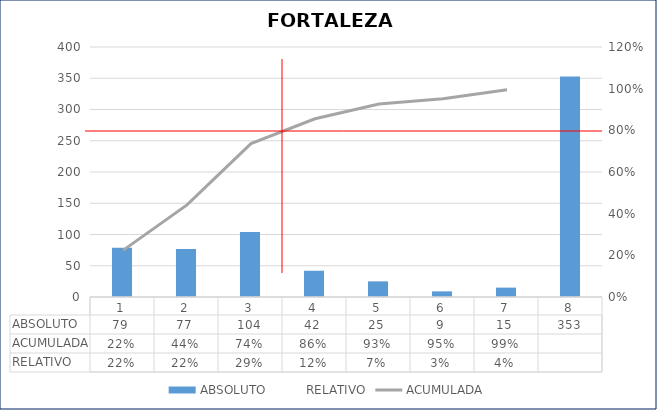
| Category | ABSOLUTO |
|---|---|
| 0 | 79 |
| 1 | 77 |
| 2 | 104 |
| 3 | 42 |
| 4 | 25 |
| 5 | 9 |
| 6 | 15 |
| 7 | 353 |